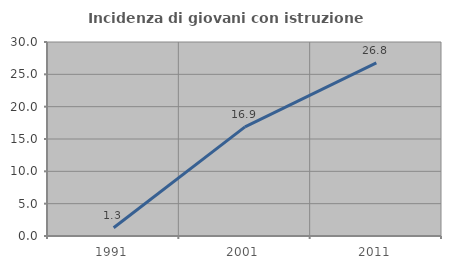
| Category | Incidenza di giovani con istruzione universitaria |
|---|---|
| 1991.0 | 1.282 |
| 2001.0 | 16.883 |
| 2011.0 | 26.786 |